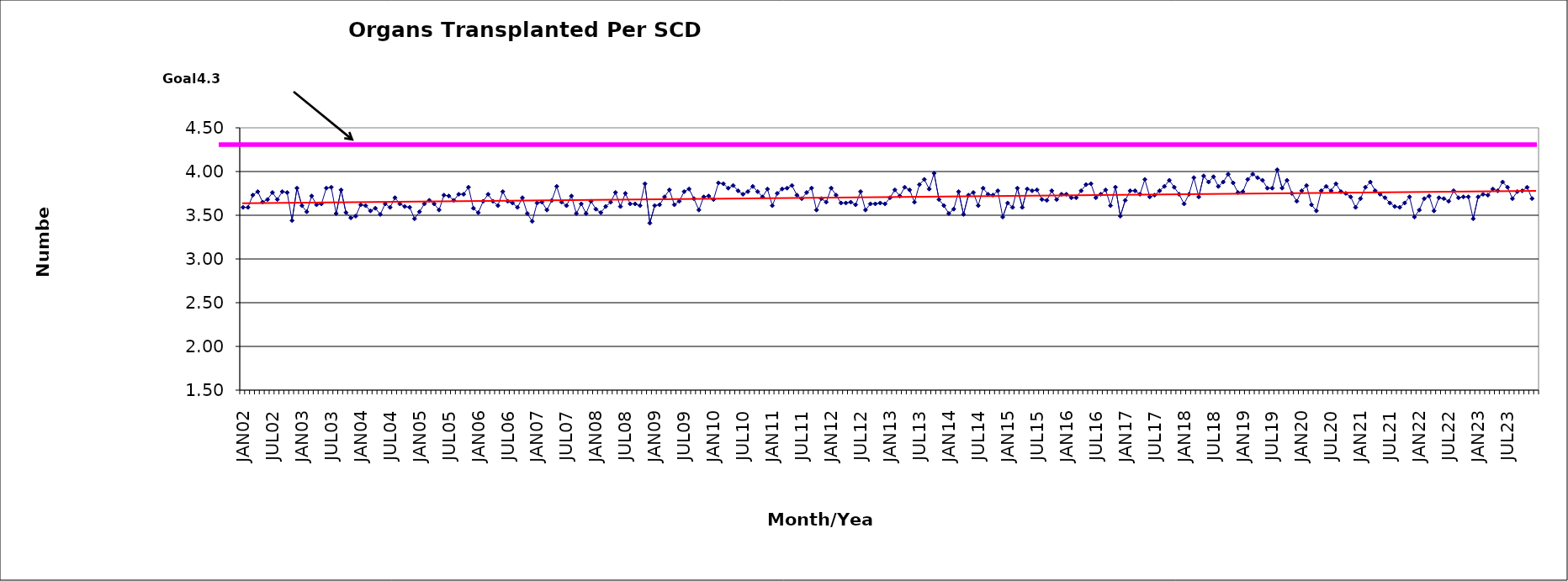
| Category | Series 0 |
|---|---|
| JAN02 | 3.59 |
| FEB02 | 3.59 |
| MAR02 | 3.73 |
| APR02 | 3.77 |
| MAY02 | 3.65 |
| JUN02 | 3.68 |
| JUL02 | 3.76 |
| AUG02 | 3.68 |
| SEP02 | 3.77 |
| OCT02 | 3.76 |
| NOV02 | 3.44 |
| DEC02 | 3.81 |
| JAN03 | 3.61 |
| FEB03 | 3.54 |
| MAR03 | 3.72 |
| APR03 | 3.62 |
| MAY03 | 3.63 |
| JUN03 | 3.81 |
| JUL03 | 3.82 |
| AUG03 | 3.52 |
| SEP03 | 3.79 |
| OCT03 | 3.53 |
| NOV03 | 3.47 |
| DEC03 | 3.49 |
| JAN04 | 3.62 |
| FEB04 | 3.61 |
| MAR04 | 3.55 |
| APR04 | 3.58 |
| MAY04 | 3.51 |
| JUN04 | 3.63 |
| JUL04 | 3.59 |
| AUG04 | 3.7 |
| SEP04 | 3.63 |
| OCT04 | 3.6 |
| NOV04 | 3.59 |
| DEC04 | 3.46 |
| JAN05 | 3.54 |
| FEB05 | 3.63 |
| MAR05 | 3.67 |
| APR05 | 3.63 |
| MAY05 | 3.56 |
| JUN05 | 3.73 |
| JUL05 | 3.72 |
| AUG05 | 3.67 |
| SEP05 | 3.74 |
| OCT05 | 3.74 |
| NOV05 | 3.82 |
| DEC05 | 3.58 |
| JAN06 | 3.53 |
| FEB06 | 3.66 |
| MAR06 | 3.74 |
| APR06 | 3.66 |
| MAY06 | 3.61 |
| JUN06 | 3.77 |
| JUL06 | 3.66 |
| AUG06 | 3.64 |
| SEP06 | 3.59 |
| OCT06 | 3.7 |
| NOV06 | 3.52 |
| DEC06 | 3.43 |
| JAN07 | 3.64 |
| FEB07 | 3.65 |
| MAR07 | 3.56 |
| APR07 | 3.67 |
| MAY07 | 3.83 |
| JUN07 | 3.65 |
| JUL07 | 3.61 |
| AUG07 | 3.72 |
| SEP07 | 3.52 |
| OCT07 | 3.63 |
| NOV07 | 3.52 |
| DEC07 | 3.66 |
| JAN08 | 3.57 |
| FEB08 | 3.53 |
| MAR08 | 3.6 |
| APR08 | 3.65 |
| MAY08 | 3.76 |
| JUN08 | 3.6 |
| JUL08 | 3.75 |
| AUG08 | 3.63 |
| SEP08 | 3.63 |
| OCT08 | 3.61 |
| NOV08 | 3.86 |
| DEC08 | 3.41 |
| JAN09 | 3.61 |
| FEB09 | 3.62 |
| MAR09 | 3.71 |
| APR09 | 3.79 |
| MAY09 | 3.62 |
| JUN09 | 3.66 |
| JUL09 | 3.77 |
| AUG09 | 3.8 |
| SEP09 | 3.69 |
| OCT09 | 3.56 |
| NOV09 | 3.71 |
| DEC09 | 3.72 |
| JAN10 | 3.68 |
| FEB10 | 3.87 |
| MAR10 | 3.86 |
| APR10 | 3.81 |
| MAY10 | 3.84 |
| JUN10 | 3.78 |
| JUL10 | 3.74 |
| AUG10 | 3.77 |
| SEP10 | 3.83 |
| OCT10 | 3.77 |
| NOV10 | 3.71 |
| DEC10 | 3.8 |
| JAN11 | 3.61 |
| FEB11 | 3.75 |
| MAR11 | 3.8 |
| APR11 | 3.81 |
| MAY11 | 3.84 |
| JUN11 | 3.73 |
| JUL11 | 3.69 |
| AUG11 | 3.76 |
| SEP11 | 3.81 |
| OCT11 | 3.56 |
| NOV11 | 3.69 |
| DEC11 | 3.65 |
| JAN12 | 3.81 |
| FEB12 | 3.73 |
| MAR12 | 3.64 |
| APR12 | 3.64 |
| MAY12 | 3.65 |
| JUN12 | 3.62 |
| JUL12 | 3.77 |
| AUG12 | 3.56 |
| SEP12 | 3.63 |
| OCT12 | 3.63 |
| NOV12 | 3.64 |
| DEC12 | 3.63 |
| JAN13 | 3.7 |
| FEB13 | 3.79 |
| MAR13 | 3.72 |
| APR13 | 3.82 |
| MAY13 | 3.79 |
| JUN13 | 3.65 |
| JUL13 | 3.85 |
| AUG13 | 3.91 |
| SEP13 | 3.8 |
| OCT13 | 3.98 |
| NOV13 | 3.68 |
| DEC13 | 3.61 |
| JAN14 | 3.52 |
| FEB14 | 3.57 |
| MAR14 | 3.77 |
| APR14 | 3.51 |
| MAY14 | 3.73 |
| JUN14 | 3.76 |
| JUL14 | 3.61 |
| AUG14 | 3.81 |
| SEP14 | 3.74 |
| OCT14 | 3.73 |
| NOV14 | 3.78 |
| DEC14 | 3.48 |
| JAN15 | 3.64 |
| FEB15 | 3.59 |
| MAR15 | 3.81 |
| APR15 | 3.59 |
| MAY15 | 3.8 |
| JUN15 | 3.78 |
| JUL15 | 3.79 |
| AUG15 | 3.68 |
| SEP15 | 3.67 |
| OCT15 | 3.78 |
| NOV15 | 3.68 |
| DEC15 | 3.74 |
| JAN16 | 3.74 |
| FEB16 | 3.7 |
| MAR16 | 3.7 |
| APR16 | 3.78 |
| MAY16 | 3.85 |
| JUN16 | 3.86 |
| JUL16 | 3.7 |
| AUG16 | 3.74 |
| SEP16 | 3.79 |
| OCT16 | 3.61 |
| NOV16 | 3.82 |
| DEC16 | 3.49 |
| JAN17 | 3.67 |
| FEB17 | 3.78 |
| MAR17 | 3.78 |
| APR17 | 3.74 |
| MAY17 | 3.91 |
| JUN17 | 3.71 |
| JUL17 | 3.73 |
| AUG17 | 3.78 |
| SEP17 | 3.83 |
| OCT17 | 3.9 |
| NOV17 | 3.82 |
| DEC17 | 3.74 |
| JAN18 | 3.63 |
| FEB18 | 3.74 |
| MAR18 | 3.93 |
| APR18 | 3.71 |
| MAY18 | 3.95 |
| JUN18 | 3.88 |
| JUL18 | 3.94 |
| AUG18 | 3.83 |
| SEP18 | 3.88 |
| OCT18 | 3.97 |
| NOV18 | 3.87 |
| DEC18 | 3.76 |
| JAN19 | 3.77 |
| FEB19 | 3.91 |
| MAR19 | 3.97 |
| APR19 | 3.93 |
| MAY19 | 3.9 |
| JUN19 | 3.81 |
| JUL19 | 3.81 |
| AUG19 | 4.02 |
| SEP19 | 3.81 |
| OCT19 | 3.9 |
| NOV19 | 3.75 |
| DEC19 | 3.66 |
| JAN20 | 3.78 |
| FEB20 | 3.84 |
| MAR20 | 3.62 |
| APR20 | 3.55 |
| MAY20 | 3.78 |
| JUN20 | 3.83 |
| JUL20 | 3.78 |
| AUG20 | 3.86 |
| SEP20 | 3.77 |
| OCT20 | 3.75 |
| NOV20 | 3.71 |
| DEC20 | 3.59 |
| JAN21 | 3.69 |
| FEB21 | 3.82 |
| MAR21 | 3.88 |
| APR21 | 3.78 |
| MAY21 | 3.74 |
| JUN21 | 3.7 |
| JUL21 | 3.64 |
| AUG21 | 3.6 |
| SEP21 | 3.59 |
| OCT21 | 3.64 |
| NOV21 | 3.71 |
| DEC21 | 3.48 |
| JAN22 | 3.56 |
| FEB22 | 3.69 |
| MAR22 | 3.72 |
| APR22 | 3.55 |
| MAY22 | 3.7 |
| JUN22 | 3.69 |
| JUL22 | 3.66 |
| AUG22 | 3.78 |
| SEP22 | 3.7 |
| OCT22 | 3.71 |
| NOV22 | 3.71 |
| DEC22 | 3.46 |
| JAN23 | 3.71 |
| FEB23 | 3.74 |
| MAR23 | 3.73 |
| APR23 | 3.8 |
| MAY23 | 3.78 |
| JUN23 | 3.88 |
| JUL23 | 3.82 |
| AUG23 | 3.69 |
| SEP23 | 3.77 |
| OCT23 | 3.78 |
| NOV23 | 3.82 |
| DEC23 | 3.69 |